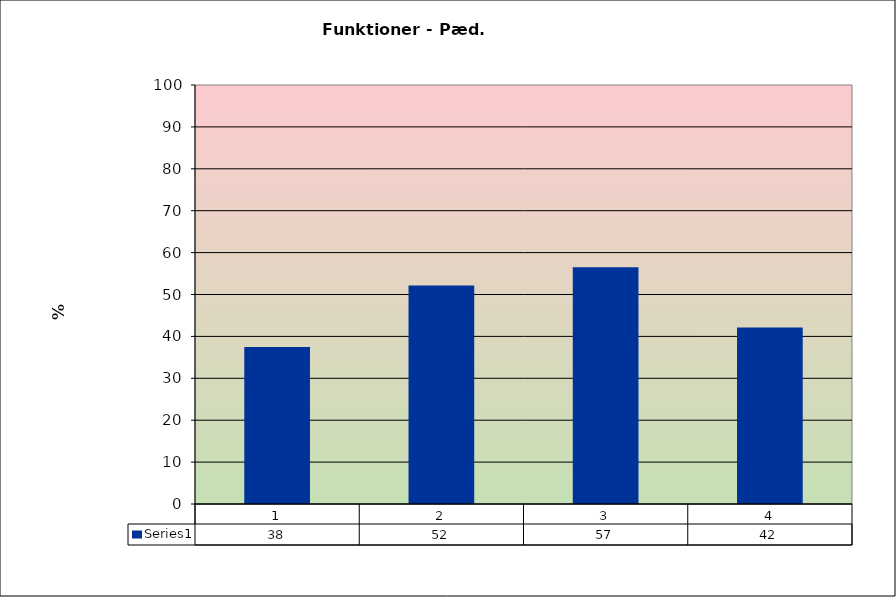
| Category | Series1 |
|---|---|
| 0 | 37.5 |
| 1 | 52.174 |
| 2 | 56.522 |
| 3 | 42.105 |